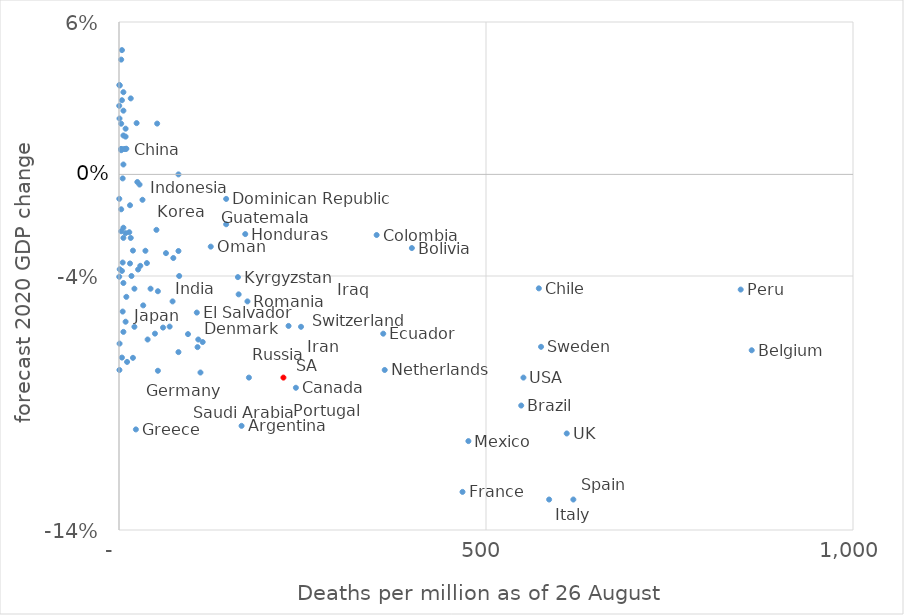
| Category | GDP 2020 forecast |
|---|---|
| 23.0 | -0.1 |
| 177.0 | -0.08 |
| 53.0 | -0.077 |
| 11.0 | -0.074 |
| 19.0 | -0.072 |
| 4.0 | -0.072 |
| 81.0 | -0.07 |
| 862.0 | -0.069 |
| 575.0 | -0.068 |
| 0.8 | -0.067 |
| 39.0 | -0.065 |
| 108.0 | -0.065 |
| 94.0 | -0.063 |
| 360.0 | -0.063 |
| 49.0 | -0.063 |
| 6.0 | -0.062 |
| 60.0 | -0.06 |
| 21.0 | -0.06 |
| 69.0 | -0.06 |
| 231.0 | -0.06 |
| 106.0 | -0.054 |
| 33.0 | -0.052 |
| 175.0 | -0.05 |
| 10.0 | -0.048 |
| 163.0 | -0.047 |
| 847.0 | -0.045 |
| 572.0 | -0.045 |
| 6.0 | -0.043 |
| 162.0 | -0.04 |
| 0.3 | -0.04 |
| 82.0 | -0.04 |
| 17.0 | -0.04 |
| 26.0 | -0.037 |
| 1.0 | -0.037 |
| 15.0 | -0.035 |
| 38.0 | -0.035 |
| 5.0 | -0.035 |
| 74.0 | -0.033 |
| 64.0 | -0.031 |
| 81.0 | -0.03 |
| 36.0 | -0.03 |
| 19.0 | -0.03 |
| 399.0 | -0.029 |
| 125.0 | -0.028 |
| 16.0 | -0.025 |
| 6.0 | -0.025 |
| 351.0 | -0.024 |
| 172.0 | -0.024 |
| 9.0 | -0.023 |
| 14.0 | -0.023 |
| 3.0 | -0.022 |
| 51.0 | -0.022 |
| 146.0 | -0.02 |
| nan | -0.016 |
| 3.0 | -0.014 |
| 15.0 | -0.012 |
| 32.0 | -0.01 |
| 146.0 | -0.01 |
| 0.4 | -0.01 |
| 5.0 | -0.002 |
| 6.0 | 0.004 |
| nan | 0.007 |
| 3.0 | 0.01 |
| 9.0 | 0.01 |
| 7.0 | 0.01 |
| 3.0 | 0.01 |
| 10.0 | 0.01 |
| 9.0 | 0.015 |
| 6.0 | 0.015 |
| 9.0 | 0.018 |
| 3.0 | 0.02 |
| 24.0 | 0.02 |
| 0.7 | 0.022 |
| 6.0 | 0.025 |
| 0.3 | 0.027 |
| 4.0 | 0.029 |
| 16.0 | 0.03 |
| 6.0 | 0.032 |
| 1.0 | 0.035 |
| 0.5 | 0.035 |
| 3.0 | 0.045 |
| 4.0 | 0.049 |
| 167.0 | -0.099 |
| 21.0 | -0.045 |
| 548.0 | -0.091 |
| 241.0 | -0.084 |
| 3.0 | 0.01 |
| 52.0 | 0.02 |
| 468.0 | -0.125 |
| 111.0 | -0.078 |
| 43.0 | -0.045 |
| 25.0 | -0.003 |
| 248.0 | -0.06 |
| 586.0 | -0.128 |
| 9.0 | -0.058 |
| 81.0 | 0 |
| 4.0 | -0.038 |
| 476.0 | -0.105 |
| 362.0 | -0.077 |
| 5.0 | -0.054 |
| 28.0 | -0.004 |
| 29.0 | -0.036 |
| 53.0 | -0.046 |
| 114.0 | -0.066 |
| 6.0 | -0.021 |
| 107.0 | -0.068 |
| 224.0 | -0.08 |
| 619.0 | -0.128 |
| 0.6 | -0.077 |
| 73.0 | -0.05 |
| 610.0 | -0.102 |
| 551.0 | -0.08 |